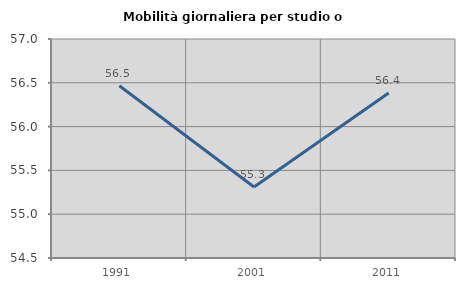
| Category | Mobilità giornaliera per studio o lavoro |
|---|---|
| 1991.0 | 56.466 |
| 2001.0 | 55.31 |
| 2011.0 | 56.383 |